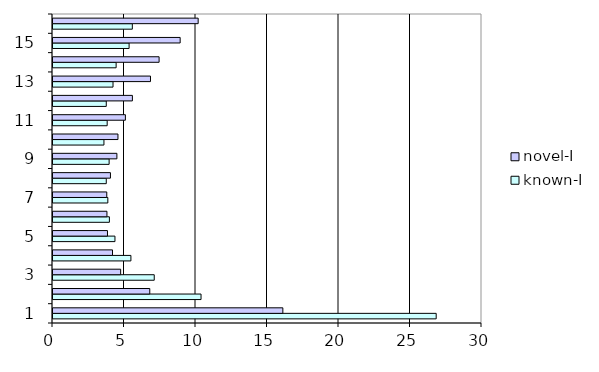
| Category | known-I | novel-I |
|---|---|---|
| 1.0 | 26.797 | 16.073 |
| 2.0 | 10.353 | 6.768 |
| 3.0 | 7.08 | 4.731 |
| 4.0 | 5.448 | 4.161 |
| 5.0 | 4.333 | 3.81 |
| 6.0 | 3.943 | 3.772 |
| 7.0 | 3.835 | 3.76 |
| 8.0 | 3.726 | 4.017 |
| 9.0 | 3.925 | 4.468 |
| 10.0 | 3.563 | 4.543 |
| 11.0 | 3.789 | 5.063 |
| 12.0 | 3.726 | 5.552 |
| 13.0 | 4.197 | 6.818 |
| 14.0 | 4.415 | 7.419 |
| 15.0 | 5.321 | 8.892 |
| 16.0 | 5.548 | 10.152 |